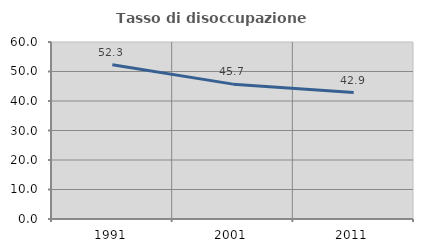
| Category | Tasso di disoccupazione giovanile  |
|---|---|
| 1991.0 | 52.273 |
| 2001.0 | 45.714 |
| 2011.0 | 42.857 |